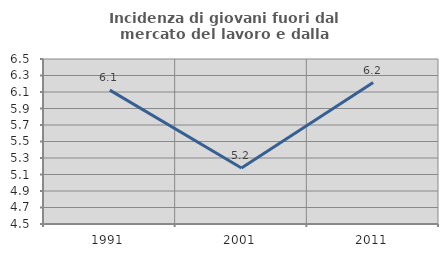
| Category | Incidenza di giovani fuori dal mercato del lavoro e dalla formazione  |
|---|---|
| 1991.0 | 6.122 |
| 2001.0 | 5.179 |
| 2011.0 | 6.215 |